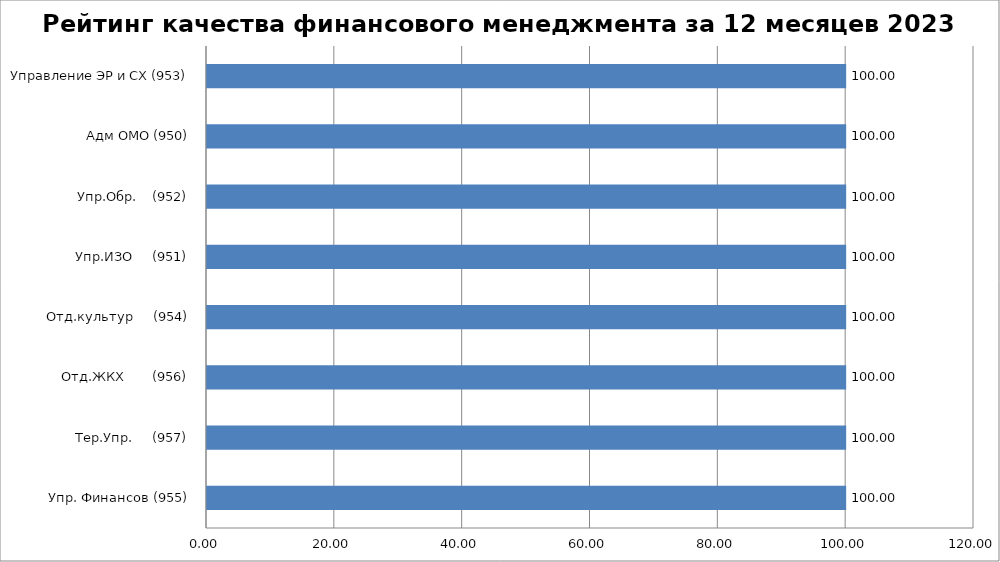
| Category | Series 0 |
|---|---|
| Упр. Финансов (955) | 100 |
| Тер.Упр.     (957) | 100 |
| Отд.ЖКХ       (956) | 100 |
| Отд.культур     (954) | 100 |
| Упр.ИЗО     (951) | 100 |
| Упр.Обр.    (952) | 100 |
| Адм ОМО (950) | 100 |
| Управление ЭР и СХ (953) | 100 |